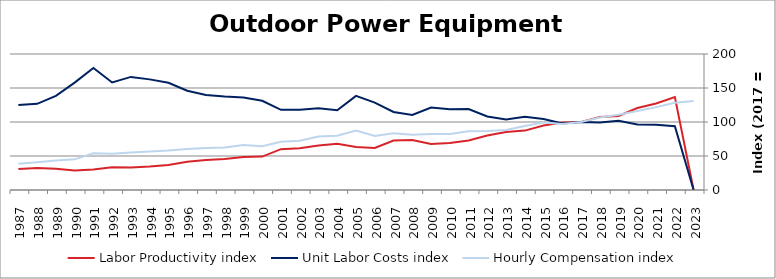
| Category | Labor Productivity index | Unit Labor Costs index | Hourly Compensation index |
|---|---|---|---|
| 2023.0 | 0 | 0 | 130.927 |
| 2022.0 | 136.668 | 93.923 | 128.363 |
| 2021.0 | 127.214 | 95.778 | 121.843 |
| 2020.0 | 120.475 | 96.38 | 116.114 |
| 2019.0 | 108.824 | 101.749 | 110.727 |
| 2018.0 | 107.477 | 99.252 | 106.673 |
| 2017.0 | 100 | 100 | 100 |
| 2016.0 | 99.327 | 97.78 | 97.121 |
| 2015.0 | 94.882 | 104.502 | 99.154 |
| 2014.0 | 87.356 | 107.739 | 94.116 |
| 2013.0 | 85.366 | 103.56 | 88.405 |
| 2012.0 | 80.187 | 108.219 | 86.778 |
| 2011.0 | 72.74 | 118.942 | 86.519 |
| 2010.0 | 69.295 | 118.721 | 82.268 |
| 2009.0 | 67.748 | 121.399 | 82.246 |
| 2008.0 | 73.462 | 110.449 | 81.138 |
| 2007.0 | 72.809 | 114.721 | 83.527 |
| 2006.0 | 61.878 | 128.551 | 79.546 |
| 2005.0 | 63.076 | 138.362 | 87.274 |
| 2004.0 | 67.981 | 117.261 | 79.715 |
| 2003.0 | 65.343 | 120.373 | 78.655 |
| 2002.0 | 61.325 | 118.192 | 72.481 |
| 2001.0 | 60.087 | 117.867 | 70.823 |
| 2000.0 | 49.099 | 131.144 | 64.39 |
| 1999.0 | 48.573 | 136.062 | 66.089 |
| 1998.0 | 45.569 | 137.409 | 62.616 |
| 1997.0 | 44.045 | 139.87 | 61.605 |
| 1996.0 | 41.417 | 145.92 | 60.435 |
| 1995.0 | 36.862 | 157.702 | 58.132 |
| 1994.0 | 34.727 | 162.698 | 56.5 |
| 1993.0 | 33.232 | 166.326 | 55.273 |
| 1992.0 | 33.62 | 158.162 | 53.173 |
| 1991.0 | 30.03 | 179.399 | 53.873 |
| 1990.0 | 28.534 | 157.887 | 45.051 |
| 1989.0 | 31.299 | 138.507 | 43.352 |
| 1988.0 | 32.236 | 126.682 | 40.837 |
| 1987.0 | 30.83 | 125.161 | 38.587 |